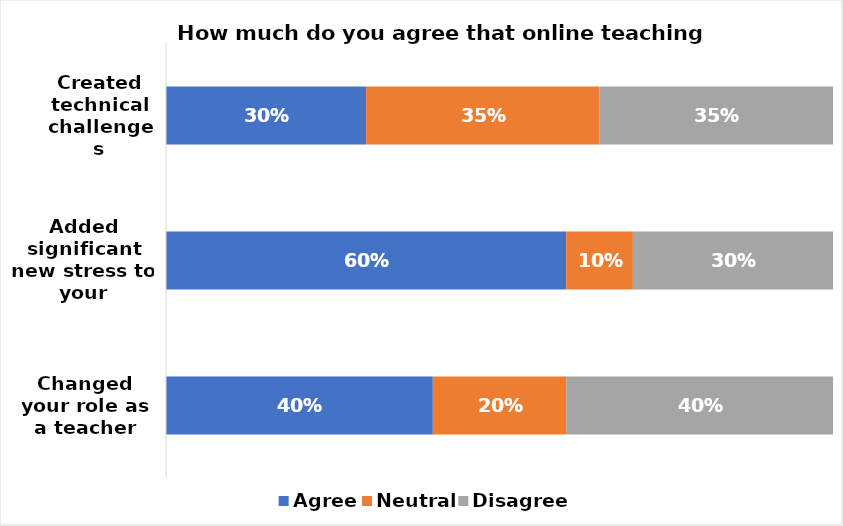
| Category | Agree | Neutral | Disagree |
|---|---|---|---|
| Created technical challenges | 0.3 | 0.35 | 0.35 |
| Added significant new stress to your workload | 0.6 | 0.1 | 0.3 |
| Changed your role as a teacher | 0.4 | 0.2 | 0.4 |